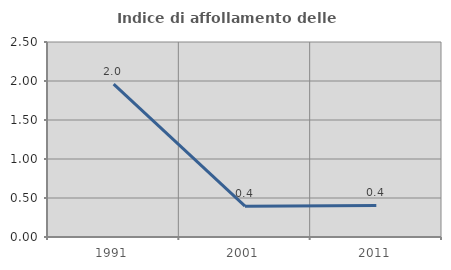
| Category | Indice di affollamento delle abitazioni  |
|---|---|
| 1991.0 | 1.961 |
| 2001.0 | 0.395 |
| 2011.0 | 0.405 |